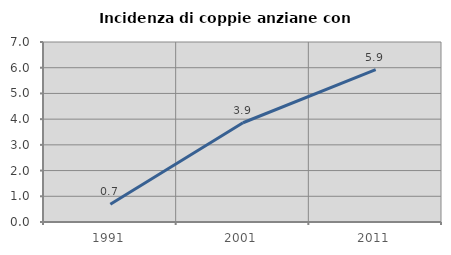
| Category | Incidenza di coppie anziane con figli |
|---|---|
| 1991.0 | 0.692 |
| 2001.0 | 3.86 |
| 2011.0 | 5.923 |